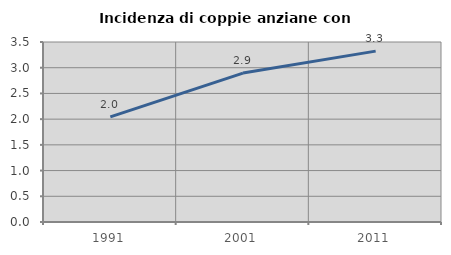
| Category | Incidenza di coppie anziane con figli |
|---|---|
| 1991.0 | 2.043 |
| 2001.0 | 2.896 |
| 2011.0 | 3.322 |